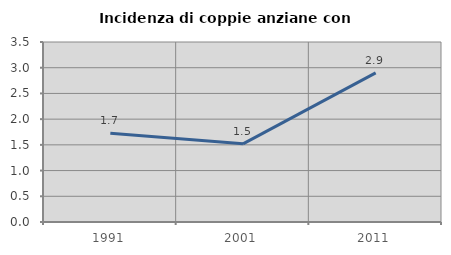
| Category | Incidenza di coppie anziane con figli |
|---|---|
| 1991.0 | 1.727 |
| 2001.0 | 1.52 |
| 2011.0 | 2.899 |